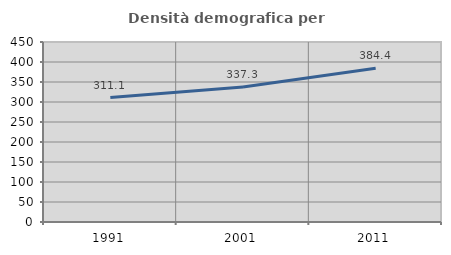
| Category | Densità demografica |
|---|---|
| 1991.0 | 311.082 |
| 2001.0 | 337.3 |
| 2011.0 | 384.434 |